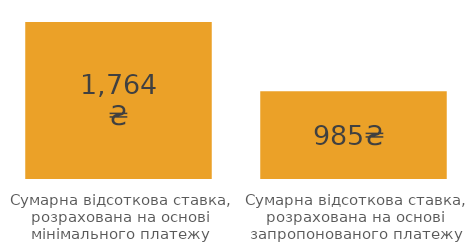
| Category | Series 0 |
|---|---|
| Сумарна відсоткова ставка, розрахована на основі мінімального платежу | 1763.952 |
| Сумарна відсоткова ставка, розрахована на основі запропонованого платежу | 984.811 |